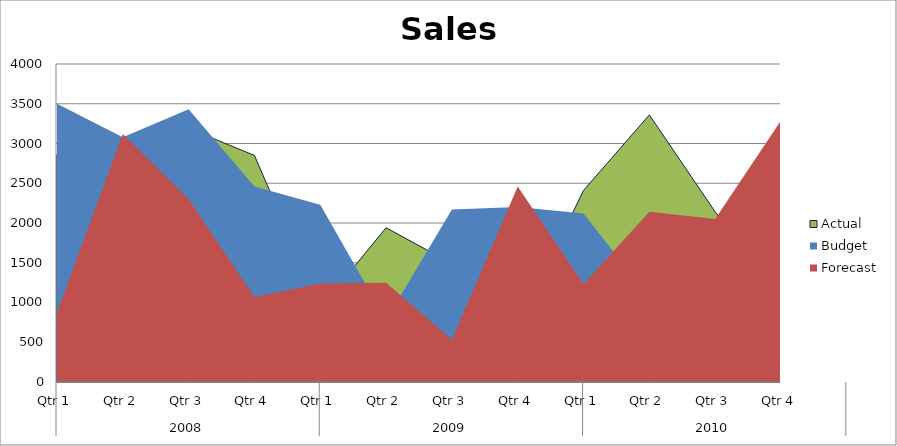
| Category | Actual | Budget | Forecast |
|---|---|---|---|
| 0 | 2860 | 3500 | 870 |
| 1 | 1820 | 3080 | 3120 |
| 2 | 3190 | 3430 | 2300 |
| 3 | 2850 | 2460 | 1070 |
| 4 | 930 | 2230 | 1240 |
| 5 | 1940 | 780 | 1250 |
| 6 | 1490 | 2170 | 530 |
| 7 | 700 | 2200 | 2460 |
| 8 | 2410 | 2120 | 1230 |
| 9 | 3360 | 1060 | 2140 |
| 10 | 2140 | 830 | 2050 |
| 11 | 1140 | 1070 | 3290 |